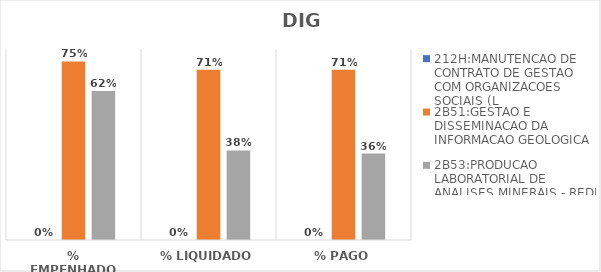
| Category | 212H:MANUTENCAO DE CONTRATO DE GESTAO COM ORGANIZACOES SOCIAIS (L | 2B51:GESTAO E DISSEMINACAO DA INFORMACAO GEOLOGICA | 2B53:PRODUCAO LABORATORIAL DE ANALISES MINERAIS - REDE LAMIN |
|---|---|---|---|
| % EMPENHADO | 0 | 0.748 | 0.624 |
| % LIQUIDADO | 0 | 0.713 | 0.375 |
| % PAGO | 0 | 0.713 | 0.362 |